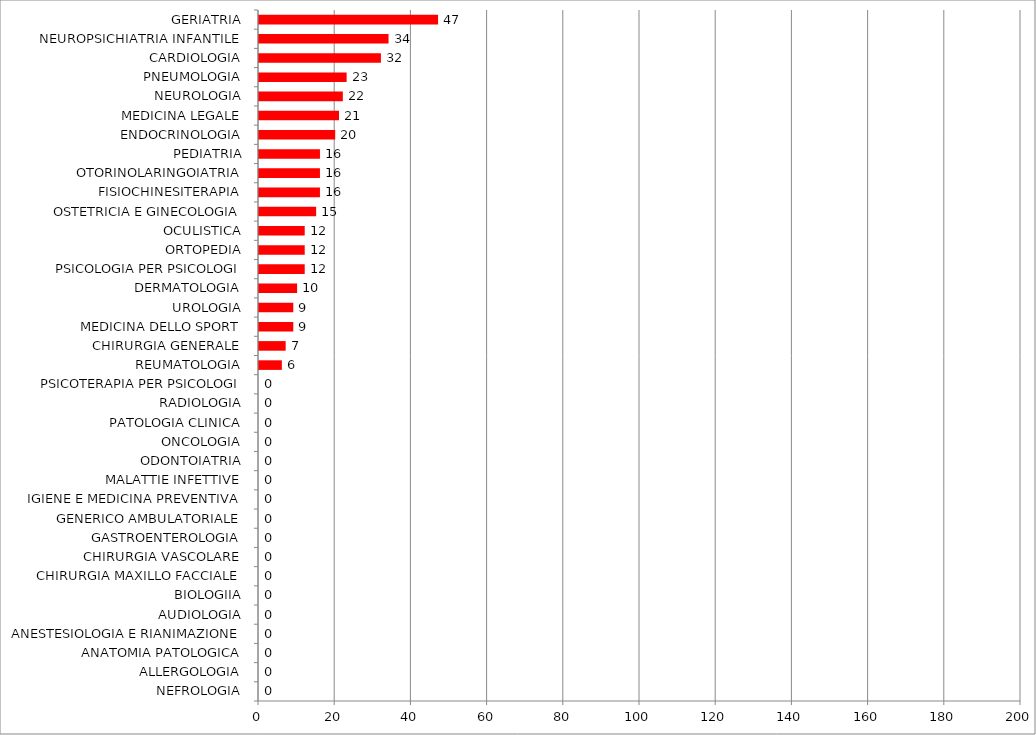
| Category | Series 0 |
|---|---|
| NEFROLOGIA | 0 |
| ALLERGOLOGIA | 0 |
| ANATOMIA PATOLOGICA | 0 |
| ANESTESIOLOGIA E RIANIMAZIONE | 0 |
| AUDIOLOGIA | 0 |
| BIOLOGIIA | 0 |
| CHIRURGIA MAXILLO FACCIALE | 0 |
| CHIRURGIA VASCOLARE | 0 |
| GASTROENTEROLOGIA | 0 |
| GENERICO AMBULATORIALE | 0 |
| IGIENE E MEDICINA PREVENTIVA | 0 |
| MALATTIE INFETTIVE | 0 |
| ODONTOIATRIA | 0 |
| ONCOLOGIA | 0 |
| PATOLOGIA CLINICA | 0 |
| RADIOLOGIA | 0 |
| PSICOTERAPIA PER PSICOLOGI | 0 |
| REUMATOLOGIA | 6 |
| CHIRURGIA GENERALE | 7 |
| MEDICINA DELLO SPORT | 9 |
| UROLOGIA | 9 |
| DERMATOLOGIA | 10 |
| PSICOLOGIA PER PSICOLOGI | 12 |
| ORTOPEDIA | 12 |
| OCULISTICA | 12 |
| OSTETRICIA E GINECOLOGIA | 15 |
| FISIOCHINESITERAPIA | 16 |
| OTORINOLARINGOIATRIA | 16 |
| PEDIATRIA | 16 |
| ENDOCRINOLOGIA | 20 |
| MEDICINA LEGALE | 21 |
| NEUROLOGIA | 22 |
| PNEUMOLOGIA | 23 |
| CARDIOLOGIA | 32 |
| NEUROPSICHIATRIA INFANTILE | 34 |
| GERIATRIA | 47 |